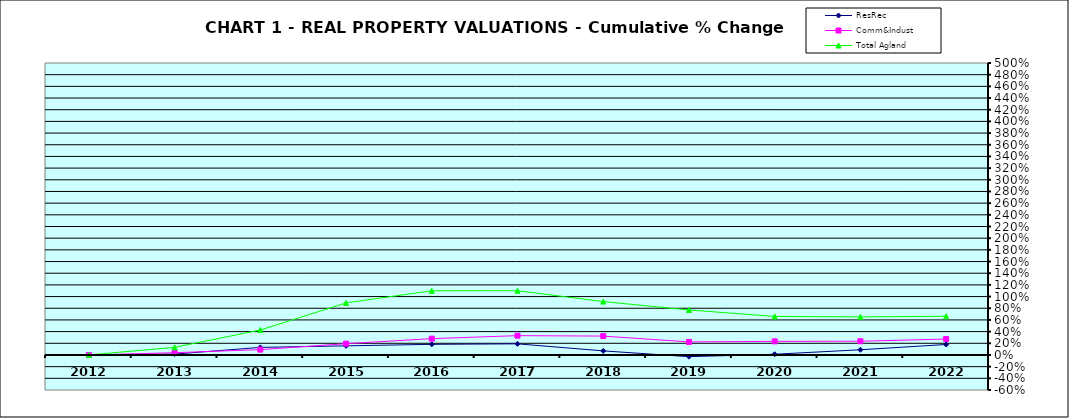
| Category | ResRec | Comm&Indust | Total Agland |
|---|---|---|---|
| 2012.0 | 0 | 0 | 0 |
| 2013.0 | 0.015 | 0.039 | 0.131 |
| 2014.0 | 0.13 | 0.092 | 0.428 |
| 2015.0 | 0.156 | 0.194 | 0.892 |
| 2016.0 | 0.182 | 0.28 | 1.099 |
| 2017.0 | 0.191 | 0.331 | 1.1 |
| 2018.0 | 0.07 | 0.323 | 0.914 |
| 2019.0 | -0.029 | 0.223 | 0.771 |
| 2020.0 | 0.012 | 0.233 | 0.66 |
| 2021.0 | 0.089 | 0.235 | 0.653 |
| 2022.0 | 0.179 | 0.272 | 0.663 |